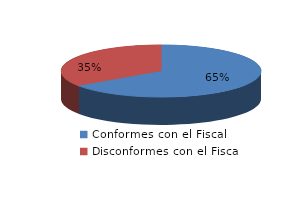
| Category | Series 0 |
|---|---|
| 0 | 623 |
| 1 | 331 |